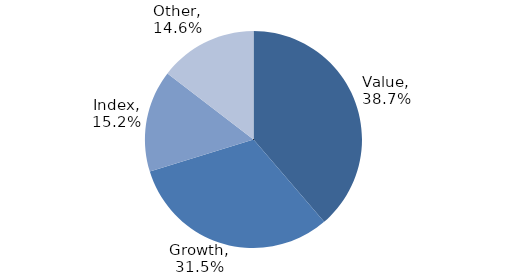
| Category | Investment Style |
|---|---|
| Value | 0.387 |
| Growth | 0.315 |
| Index | 0.152 |
| Other | 0.146 |